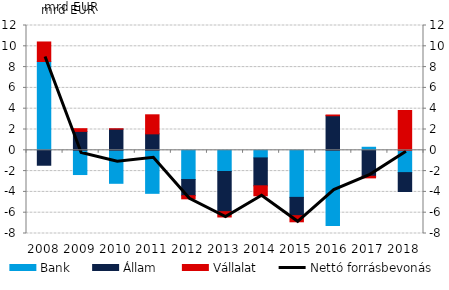
| Category | Bank | Állam  | Vállalat |
|---|---|---|---|
| 2008.0 | 8.54 | -1.437 | 1.876 |
| 2009.0 | -2.33 | 1.819 | 0.26 |
| 2010.0 | -3.173 | 2.035 | 0.033 |
| 2011.0 | -4.137 | 1.583 | 1.83 |
| 2012.0 | -2.812 | -1.551 | -0.303 |
| 2013.0 | -2.041 | -3.858 | -0.512 |
| 2014.0 | -0.731 | -2.683 | -0.959 |
| 2015.0 | -4.526 | -1.758 | -0.59 |
| 2016.0 | -7.221 | 3.323 | 0.071 |
| 2017.0 | 0.292 | -2.498 | -0.154 |
| 2018.0 | -2.145 | -1.814 | 3.829 |